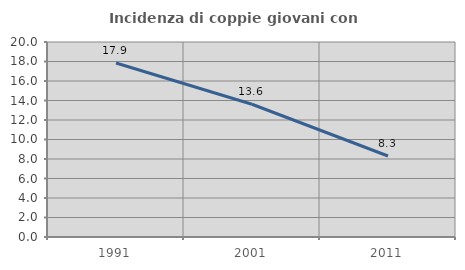
| Category | Incidenza di coppie giovani con figli |
|---|---|
| 1991.0 | 17.851 |
| 2001.0 | 13.614 |
| 2011.0 | 8.306 |